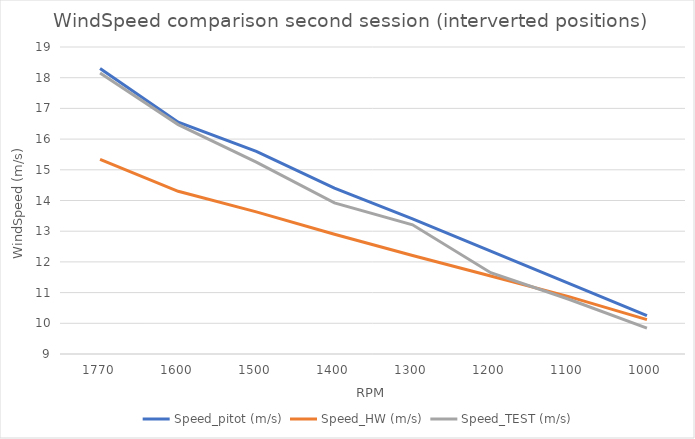
| Category | Speed_pitot (m/s) | Speed_HW (m/s) | Speed_TEST (m/s) |
|---|---|---|---|
| 1770.0 | 18.3 | 15.34 | 18.153 |
| 1600.0 | 16.55 | 14.3 | 16.473 |
| 1500.0 | 15.6 | 13.63 | 15.251 |
| 1400.0 | 14.4 | 12.9 | 13.923 |
| 1300.0 | 13.4 | 12.21 | 13.208 |
| 1200.0 | 12.35 | 11.54 | 11.648 |
| 1100.0 | 11.3 | 10.87 | 10.784 |
| 1000.0 | 10.25 | 10.12 | 9.845 |